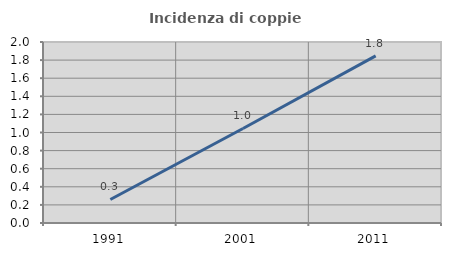
| Category | Incidenza di coppie miste |
|---|---|
| 1991.0 | 0.26 |
| 2001.0 | 1.044 |
| 2011.0 | 1.846 |